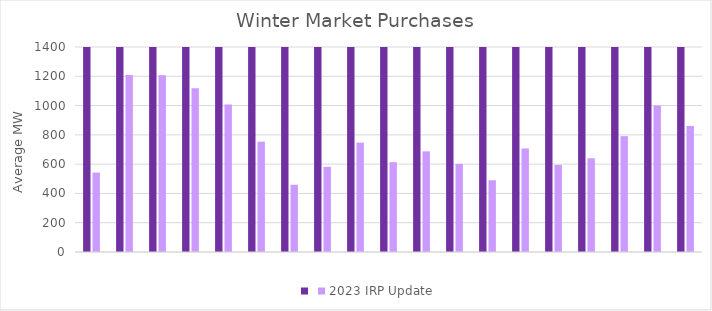
| Category | Series 0 | 2023 IRP Update |
|---|---|---|
|  | 2024 | 542.319 |
|  | 2025 | 1209.16 |
|  | 2026 | 1207.059 |
|  | 2027 | 1117.951 |
|  | 2028 | 1007.702 |
|  | 2029 | 753.391 |
|  | 2030 | 459.153 |
|  | 2031 | 581.622 |
|  | 2032 | 747.121 |
|  | 2033 | 613.221 |
|  | 2034 | 687.531 |
|  | 2035 | 601.656 |
|  | 2036 | 489.877 |
|  | 2037 | 707.268 |
|  | 2038 | 594.621 |
|  | 2039 | 639.949 |
|  | 2040 | 791.342 |
|  | 2041 | 999.857 |
|  | 2042 | 860.745 |